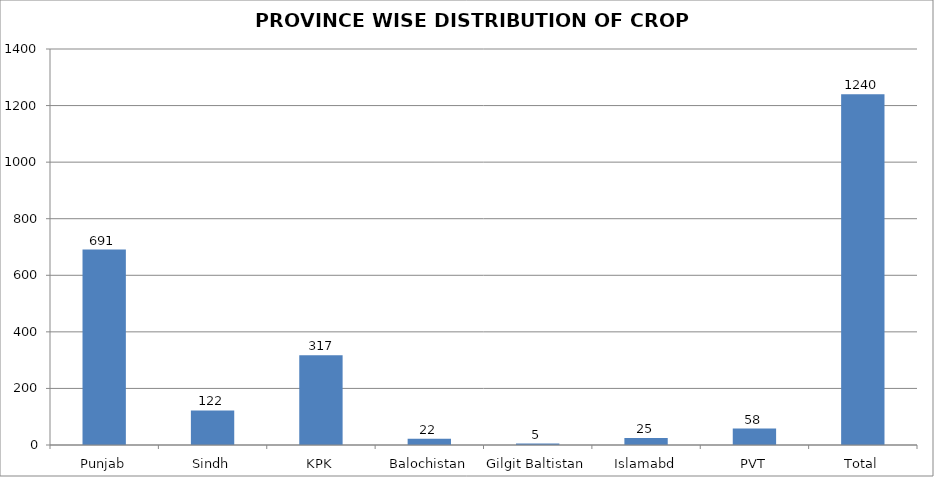
| Category | Series 0 |
|---|---|
| Punjab | 691 |
| Sindh | 122 |
| KPK | 317 |
| Balochistan | 22 |
| Gilgit Baltistan | 5 |
| Islamabd | 25 |
| PVT | 58 |
| Total | 1240 |